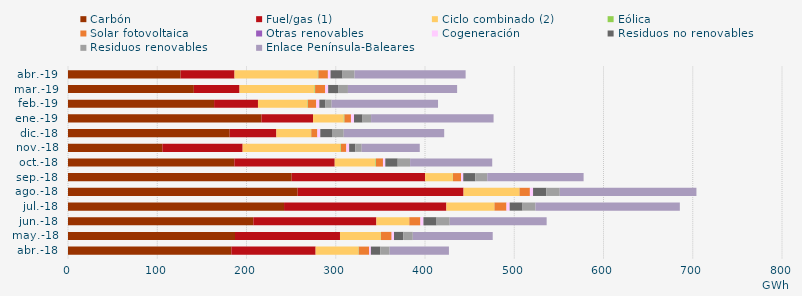
| Category | Carbón | Fuel/gas (1) | Ciclo combinado (2) | Eólica | Solar fotovoltaica | Otras renovables | Cogeneración | Residuos no renovables | Residuos renovables | Enlace Península-Baleares |
|---|---|---|---|---|---|---|---|---|---|---|
| abr.-18 | 183.056 | 94.399 | 48.047 | 0.283 | 11.478 | 0.131 | 1.982 | 10.487 | 10.487 | 66.468 |
| may.-18 | 187.116 | 117.635 | 45.725 | 0.229 | 11.853 | 0.128 | 2.579 | 10.525 | 10.525 | 89.565 |
| jun.-18 | 207.641 | 137.881 | 36.754 | 0.139 | 12.384 | 0.11 | 3.357 | 14.709 | 14.709 | 108.624 |
| jul.-18 | 242.068 | 181.893 | 53.755 | 0.139 | 13.403 | 0.058 | 3.566 | 14.429 | 14.429 | 161.792 |
| ago.-18 | 257.313 | 185.888 | 62.511 | 0.192 | 11.591 | 0.057 | 3.515 | 14.961 | 14.961 | 153.134 |
| sep.-18 | 250.63 | 149.447 | 31.105 | 0.198 | 9.026 | 0.019 | 2.437 | 13.454 | 13.454 | 107.931 |
| oct.-18 | 186.346 | 112.508 | 45.569 | 0.62 | 7.845 | 0.06 | 2.572 | 13.898 | 13.898 | 92.008 |
| nov.-18 | 105.718 | 89.969 | 109.561 | 0.555 | 5.981 | 0.069 | 3.146 | 7.033 | 7.033 | 65.068 |
| dic.-18 | 181.178 | 52.297 | 38.724 | 0.419 | 6.672 | 0.131 | 3.26 | 13.125 | 13.125 | 112.575 |
| ene.-19 | 216.788 | 57.737 | 34.412 | 0.805 | 7.277 | 0.108 | 3.342 | 9.561 | 9.561 | 137.255 |
| feb.-19 | 163.684 | 49.178 | 55.402 | 0.499 | 9.319 | 0.082 | 3.484 | 6.86 | 6.86 | 119.224 |
| mar.-19 | 141.025 | 51.184 | 83.928 | 0.702 | 11.28 | 0.111 | 3.267 | 11.084 | 11.084 | 122.325 |
| abr.-19 | 126.207 | 60.374 | 93.323 | 0.639 | 10.622 | 0.09 | 2.915 | 13.456 | 13.456 | 124.431 |